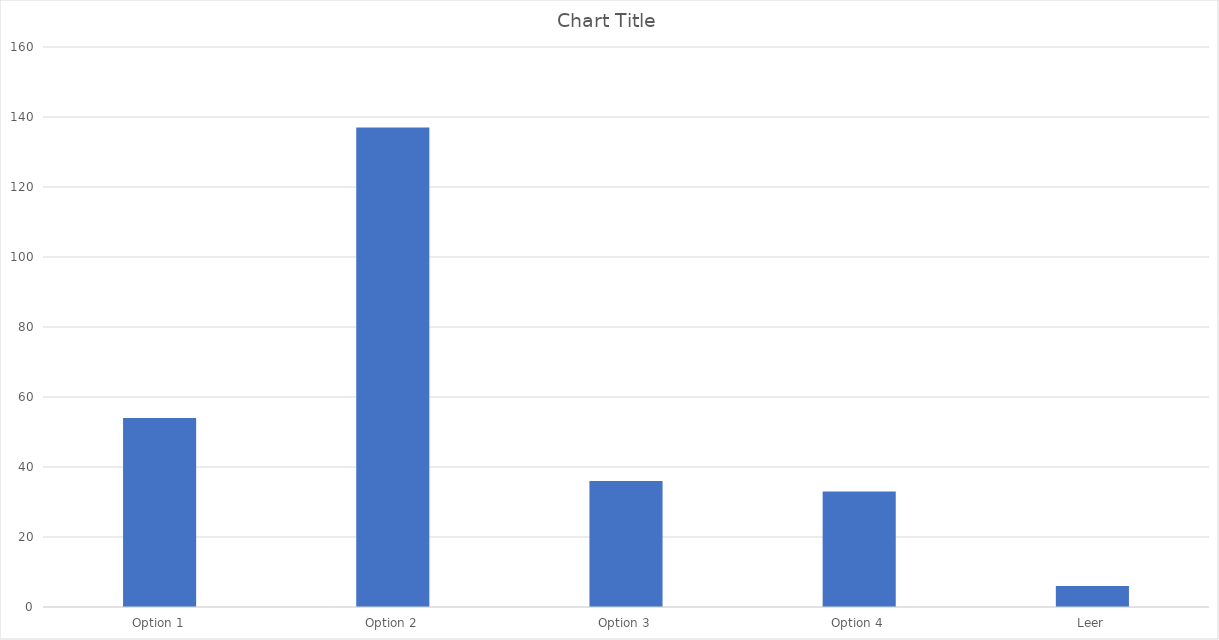
| Category | Series 0 |
|---|---|
| Option 1 | 54 |
| Option 2 | 137 |
| Option 3 | 36 |
| Option 4 | 33 |
| Leer | 6 |